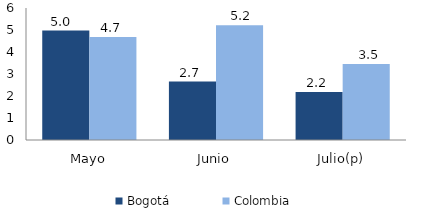
| Category | Bogotá | Colombia |
|---|---|---|
| Mayo | 4.974 | 4.685 |
| Junio | 2.655 | 5.215 |
| Julio(p) | 2.181 | 3.458 |